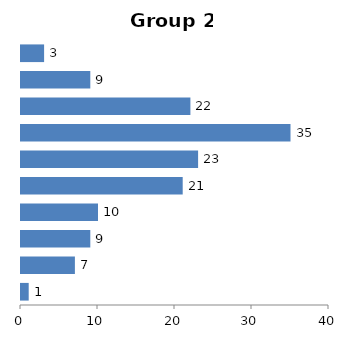
| Category | Group 2 |
|---|---|
| 0-10 | 1 |
| 11-20 | 7 |
| 21-30 | 9 |
| 31-40 | 10 |
| 41-50 | 21 |
| 51-60 | 23 |
| 61-70 | 35 |
| 71-80 | 22 |
| 81-90 | 9 |
| 91-100 | 3 |